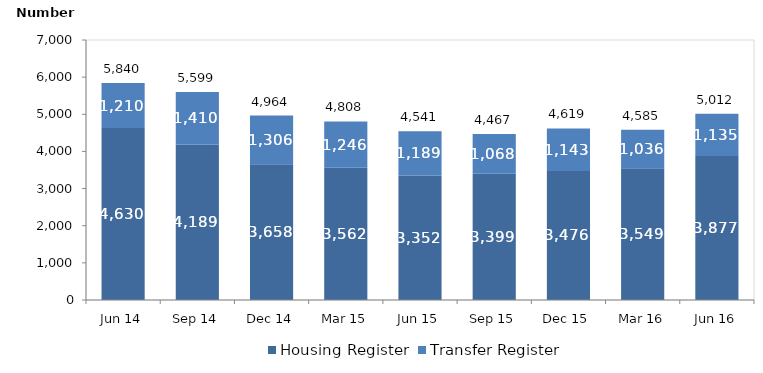
| Category | Housing Register | Transfer Register |
|---|---|---|
| Jun 14 | 4630 | 1210 |
| Sep 14 | 4189 | 1410 |
| Dec 14 | 3658 | 1306 |
| Mar 15 | 3562 | 1246 |
| Jun 15 | 3352 | 1189 |
| Sep 15 | 3399 | 1068 |
| Dec 15 | 3476 | 1143 |
| Mar 16 | 3549 | 1036 |
| Jun 16 | 3877 | 1135 |